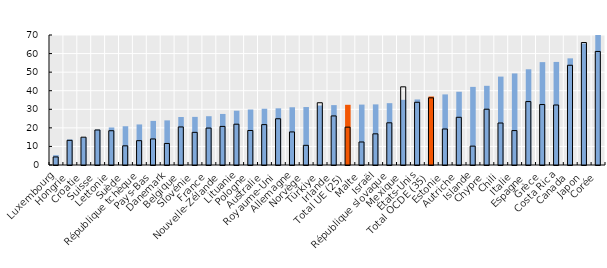
| Category | Nés à l’étranger | Nés dans le pays |
|---|---|---|
| Luxembourg | 5.298 | 4.333 |
| Hongrie | 13.759 | 13.288 |
| Croatie | 14.842 | 14.971 |
| Suisse | 19.05 | 18.853 |
| Lettonie | 20.202 | 18.453 |
| Suède | 20.878 | 10.331 |
| République tchèque | 21.841 | 13.101 |
| Pays-Bas | 23.75 | 14.032 |
| Danemark | 24.028 | 11.595 |
| Belgique | 25.838 | 20.494 |
| Slovénie | 25.91 | 17.581 |
| France | 26.273 | 19.886 |
| Nouvelle-Zélande | 27.491 | 20.774 |
| Lituanie | 29.24 | 21.972 |
| Pologne | 29.883 | 18.582 |
| Australie | 30.301 | 21.747 |
| Royaume-Uni | 30.526 | 24.896 |
| Allemagne | 31.092 | 17.81 |
| Norvège | 31.216 | 10.588 |
| Türkiye | 32.037 | 33.521 |
| Irlande | 32.249 | 26.422 |
| Total UE (25) | 32.416 | 20.382 |
| Malte | 32.531 | 12.39 |
| Israël | 32.64 | 16.78 |
| République slovaque | 33.293 | 22.721 |
| Mexique | 35.1 | 42.1 |
| États-Unis | 35.29 | 33.78 |
| Total OCDE (35) | 36.889 | 36.166 |
| Estonie | 38.012 | 19.391 |
| Autriche | 39.451 | 25.694 |
| Islande | 42.063 | 10.157 |
| Chypre | 42.643 | 30.039 |
| Chili | 47.6 | 22.6 |
| Italie | 49.306 | 18.533 |
| Espagne | 51.554 | 34.154 |
| Grèce | 55.395 | 32.557 |
| Costa Rica | 55.5 | 32.3 |
| Canada | 57.43 | 53.711 |
| Japon | 65.41 | 65.95 |
| Corée | 72.717 | 61.133 |